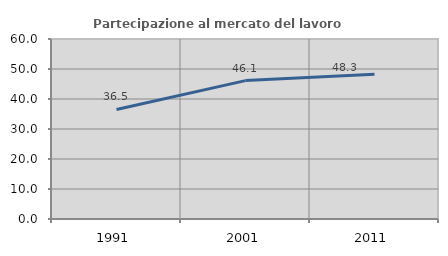
| Category | Partecipazione al mercato del lavoro  femminile |
|---|---|
| 1991.0 | 36.512 |
| 2001.0 | 46.135 |
| 2011.0 | 48.284 |